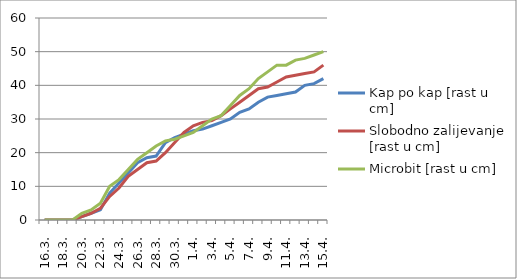
| Category | Kap po kap [rast u cm] | Slobodno zalijevanje [rast u cm] | Microbit [rast u cm] |
|---|---|---|---|
| 16.3. | 0 | 0 | 0 |
| 17.3. | 0 | 0 | 0 |
| 18.3. | 0 | 0 | 0 |
| 19.3. | 0 | 0 | 0 |
| 20.3. | 1 | 1 | 2 |
| 21.3. | 2 | 2 | 3 |
| 22.3. | 3 | 3.5 | 5 |
| 23.3. | 8 | 7 | 10 |
| 24.3. | 11 | 9.5 | 12 |
| 25.3. | 14 | 13 | 15 |
| 26.3. | 17 | 15 | 18 |
| 27.3. | 18.5 | 17 | 20 |
| 28.3. | 19 | 17.5 | 22 |
| 29.3. | 23 | 20 | 23.5 |
| 30.3. | 24.5 | 23 | 24 |
| 31.3. | 25.5 | 26 | 25 |
| 1.4. | 26.5 | 28 | 26 |
| 2.4. | 27 | 29 | 28 |
| 3.4. | 28 | 29.5 | 30 |
| 4.4. | 29 | 31 | 31 |
| 5.4. | 30 | 33 | 34 |
| 6.4. | 32 | 35 | 37 |
| 7.4. | 33 | 37 | 39 |
| 8.4. | 35 | 39 | 42 |
| 9.4. | 36.5 | 39.5 | 44 |
| 10.4. | 37 | 41 | 46 |
| 11.4. | 37.5 | 42.5 | 46 |
| 12.4. | 38 | 43 | 47.5 |
| 13.4. | 40 | 43.5 | 48 |
| 14.4. | 40.5 | 44 | 49 |
| 15.4. | 42 | 46 | 50 |